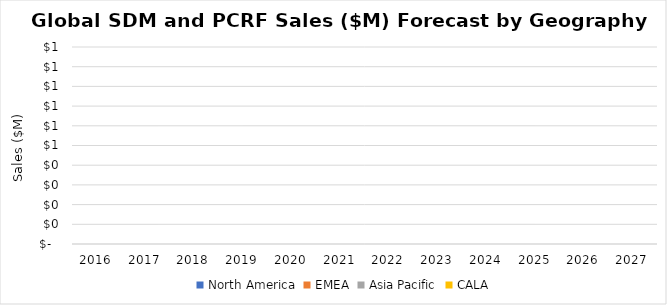
| Category | North America | EMEA | Asia Pacific | CALA |
|---|---|---|---|---|
| 2016.0 | 0 | 0 | 0 | 0 |
| 2017.0 | 0 | 0 | 0 | 0 |
| 2018.0 | 0 | 0 | 0 | 0 |
| 2019.0 | 0 | 0 | 0 | 0 |
| 2020.0 | 0 | 0 | 0 | 0 |
| 2021.0 | 0 | 0 | 0 | 0 |
| 2022.0 | 0 | 0 | 0 | 0 |
| 2023.0 | 0 | 0 | 0 | 0 |
| 2024.0 | 0 | 0 | 0 | 0 |
| 2025.0 | 0 | 0 | 0 | 0 |
| 2026.0 | 0 | 0 | 0 | 0 |
| 2027.0 | 0 | 0 | 0 | 0 |